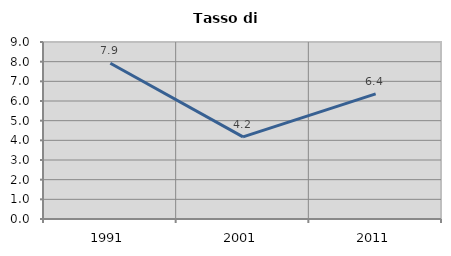
| Category | Tasso di disoccupazione   |
|---|---|
| 1991.0 | 7.92 |
| 2001.0 | 4.178 |
| 2011.0 | 6.359 |